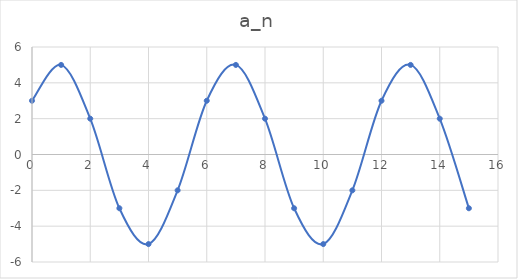
| Category | a_n |
|---|---|
| 0.0 | 3 |
| 1.0 | 5 |
| 2.0 | 2 |
| 3.0 | -3 |
| 4.0 | -5 |
| 5.0 | -2 |
| 6.0 | 3 |
| 7.0 | 5 |
| 8.0 | 2 |
| 9.0 | -3 |
| 10.0 | -5 |
| 11.0 | -2 |
| 12.0 | 3 |
| 13.0 | 5 |
| 14.0 | 2 |
| 15.0 | -3 |